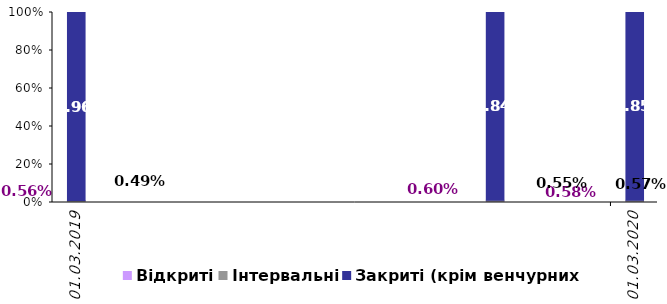
| Category | Відкриті | Інтервальні | Закриті (крім венчурних) |
|---|---|---|---|
| 2019-03-31 | 0.006 | 0.005 | 0.99 |
| 2019-12-31 | 0.006 | 0.006 | 0.988 |
| 2020-03-31 | 0.006 | 0.006 | 0.989 |